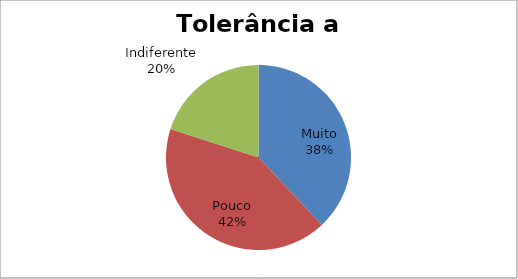
| Category | Series 0 |
|---|---|
| Muito | 19 |
| Pouco | 21 |
| Indiferente | 10 |